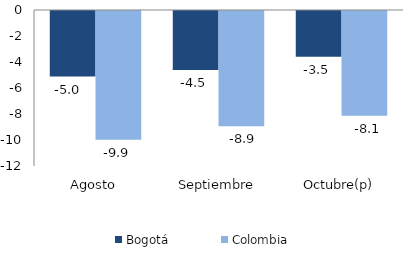
| Category | Bogotá | Colombia |
|---|---|---|
| Agosto | -5.042 | -9.895 |
| Septiembre | -4.535 | -8.856 |
| Octubre(p) | -3.519 | -8.061 |